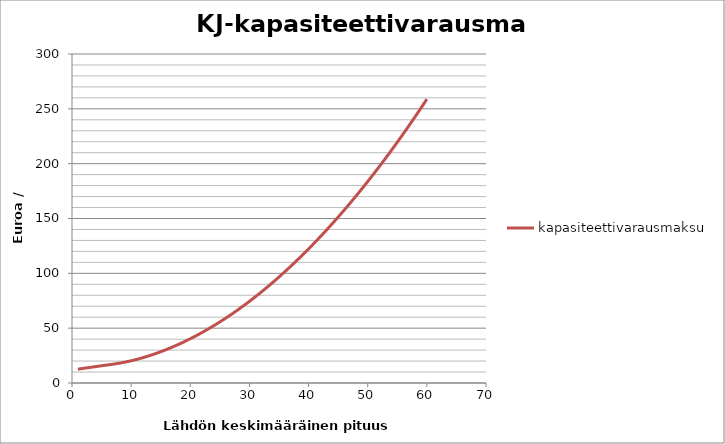
| Category | kapasiteettivarausmaksu |
|---|---|
| 1.0 | 12.603 |
| 2.0 | 13.417 |
| 3.0 | 14.159 |
| 4.0 | 14.959 |
| 5.0 | 15.712 |
| 6.0 | 16.442 |
| 7.0 | 17.204 |
| 8.0 | 18.051 |
| 9.0 | 19.075 |
| 10.0 | 20.266 |
| 11.0 | 21.615 |
| 12.0 | 23.117 |
| 13.0 | 24.769 |
| 14.0 | 26.568 |
| 15.0 | 28.512 |
| 16.0 | 30.598 |
| 17.0 | 32.827 |
| 18.0 | 35.197 |
| 19.0 | 37.708 |
| 20.0 | 40.358 |
| 21.0 | 43.147 |
| 22.0 | 46.075 |
| 23.0 | 49.141 |
| 24.0 | 52.346 |
| 25.0 | 55.688 |
| 26.0 | 59.168 |
| 27.0 | 62.785 |
| 28.0 | 66.54 |
| 29.0 | 70.432 |
| 30.0 | 74.461 |
| 31.0 | 78.627 |
| 32.0 | 82.93 |
| 33.0 | 87.37 |
| 34.0 | 91.946 |
| 35.0 | 96.66 |
| 36.0 | 101.509 |
| 37.0 | 106.496 |
| 38.0 | 111.618 |
| 39.0 | 116.878 |
| 40.0 | 122.273 |
| 41.0 | 127.805 |
| 42.0 | 133.474 |
| 43.0 | 139.279 |
| 44.0 | 145.22 |
| 45.0 | 151.297 |
| 46.0 | 157.511 |
| 47.0 | 163.861 |
| 48.0 | 170.347 |
| 49.0 | 176.969 |
| 50.0 | 183.728 |
| 51.0 | 190.623 |
| 52.0 | 197.654 |
| 53.0 | 204.821 |
| 54.0 | 212.124 |
| 55.0 | 219.564 |
| 56.0 | 227.139 |
| 57.0 | 234.851 |
| 58.0 | 242.699 |
| 59.0 | 250.683 |
| 60.0 | 258.803 |